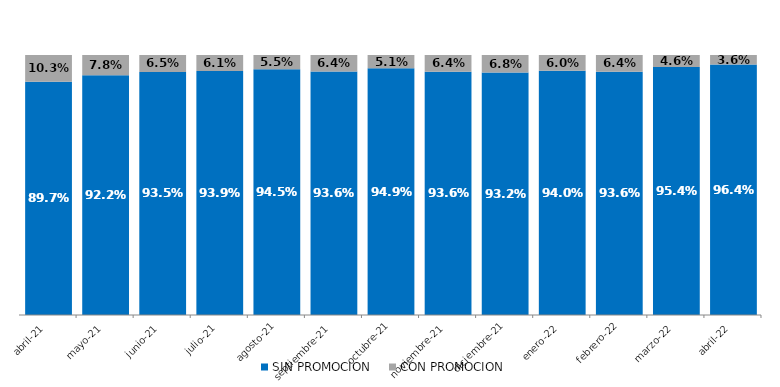
| Category | SIN PROMOCION   | CON PROMOCION   |
|---|---|---|
| 2021-04-01 | 0.897 | 0.103 |
| 2021-05-01 | 0.922 | 0.078 |
| 2021-06-01 | 0.935 | 0.065 |
| 2021-07-01 | 0.939 | 0.061 |
| 2021-08-01 | 0.945 | 0.055 |
| 2021-09-01 | 0.936 | 0.064 |
| 2021-10-01 | 0.949 | 0.051 |
| 2021-11-01 | 0.936 | 0.064 |
| 2021-12-01 | 0.932 | 0.068 |
| 2022-01-01 | 0.94 | 0.06 |
| 2022-02-01 | 0.936 | 0.064 |
| 2022-03-01 | 0.954 | 0.046 |
| 2022-04-01 | 0.964 | 0.036 |